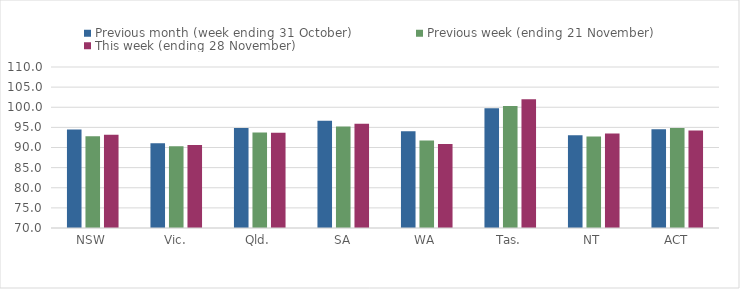
| Category | Previous month (week ending 31 October) | Previous week (ending 21 November) | This week (ending 28 November) |
|---|---|---|---|
| NSW | 94.46 | 92.77 | 93.18 |
| Vic. | 91.06 | 90.33 | 90.63 |
| Qld. | 94.82 | 93.71 | 93.67 |
| SA | 96.67 | 95.21 | 95.91 |
| WA | 94.06 | 91.75 | 90.89 |
| Tas. | 99.77 | 100.34 | 102 |
| NT | 93.07 | 92.74 | 93.49 |
| ACT | 94.52 | 94.84 | 94.24 |